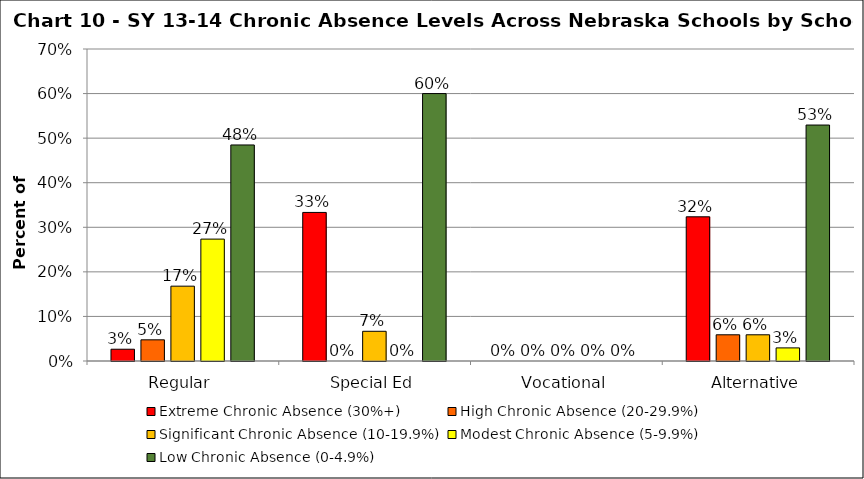
| Category | Extreme Chronic Absence (30%+) | High Chronic Absence (20-29.9%) | Significant Chronic Absence (10-19.9%) | Modest Chronic Absence (5-9.9%) | Low Chronic Absence (0-4.9%) |
|---|---|---|---|---|---|
| 0 | 0.026 | 0.048 | 0.168 | 0.273 | 0.485 |
| 1 | 0.333 | 0 | 0.067 | 0 | 0.6 |
| 2 | 0 | 0 | 0 | 0 | 0 |
| 3 | 0.324 | 0.059 | 0.059 | 0.029 | 0.529 |